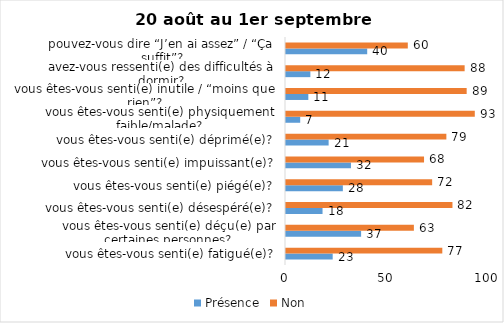
| Category | Présence | Non |
|---|---|---|
| vous êtes-vous senti(e) fatigué(e)? | 23 | 77 |
| vous êtes-vous senti(e) déçu(e) par certaines personnes? | 37 | 63 |
| vous êtes-vous senti(e) désespéré(e)? | 18 | 82 |
| vous êtes-vous senti(e) piégé(e)? | 28 | 72 |
| vous êtes-vous senti(e) impuissant(e)? | 32 | 68 |
| vous êtes-vous senti(e) déprimé(e)? | 21 | 79 |
| vous êtes-vous senti(e) physiquement faible/malade? | 7 | 93 |
| vous êtes-vous senti(e) inutile / “moins que rien”? | 11 | 89 |
| avez-vous ressenti(e) des difficultés à dormir? | 12 | 88 |
| pouvez-vous dire “J’en ai assez” / “Ça suffit”? | 40 | 60 |